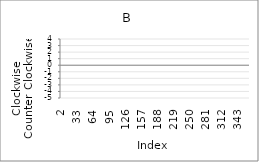
| Category | Series 0 |
|---|---|
| 2.0 | 4 |
| 3.0 | -4 |
| 4.0 | 1 |
| 5.0 | 3 |
| 6.0 | -3 |
| 7.0 | -3 |
| 8.0 | 2 |
| 9.0 | 2 |
| 10.0 | 3 |
| 11.0 | -4 |
| 12.0 | 4 |
| 13.0 | -1 |
| 14.0 | 1 |
| 15.0 | 0 |
| 16.0 | 0 |
| 17.0 | 0 |
| 18.0 | 2 |
| 19.0 | 3 |
| 20.0 | 2 |
| 21.0 | -3 |
| 22.0 | -5 |
| 23.0 | -4 |
| 24.0 | 1 |
| 25.0 | 4 |
| 26.0 | 0 |
| 27.0 | -4 |
| 28.0 | 4 |
| 29.0 | -2 |
| 30.0 | 0 |
| 31.0 | 99 |
| 32.0 | 99 |
| 33.0 | 99 |
| 34.0 | 99 |
| 35.0 | 99 |
| 36.0 | 99 |
| 37.0 | 99 |
| 38.0 | 99 |
| 39.0 | 99 |
| 40.0 | 99 |
| 41.0 | 99 |
| 42.0 | 99 |
| 43.0 | 99 |
| 44.0 | 99 |
| 45.0 | 99 |
| 46.0 | 99 |
| 47.0 | 99 |
| 48.0 | 99 |
| 49.0 | 99 |
| 50.0 | 99 |
| 51.0 | 99 |
| 52.0 | 99 |
| 53.0 | 99 |
| 54.0 | 99 |
| 55.0 | 99 |
| 56.0 | 99 |
| 57.0 | 99 |
| 58.0 | 99 |
| 59.0 | 99 |
| 60.0 | 99 |
| 61.0 | 99 |
| 62.0 | 99 |
| 63.0 | 99 |
| 64.0 | 99 |
| 65.0 | 99 |
| 66.0 | 99 |
| 67.0 | 99 |
| 68.0 | 99 |
| 69.0 | 99 |
| 70.0 | 99 |
| 71.0 | 99 |
| 72.0 | 99 |
| 73.0 | 99 |
| 74.0 | 99 |
| 75.0 | 99 |
| 76.0 | 99 |
| 77.0 | 99 |
| 78.0 | 99 |
| 79.0 | 99 |
| 80.0 | 99 |
| 81.0 | 99 |
| 82.0 | 99 |
| 83.0 | 99 |
| 84.0 | 99 |
| 85.0 | 99 |
| 86.0 | 99 |
| 87.0 | 99 |
| 88.0 | 99 |
| 89.0 | 99 |
| 90.0 | 99 |
| 91.0 | 99 |
| 92.0 | 99 |
| 93.0 | 99 |
| 94.0 | 99 |
| 95.0 | 99 |
| 96.0 | 99 |
| 97.0 | 99 |
| 98.0 | 99 |
| 99.0 | 99 |
| 100.0 | 99 |
| 101.0 | 99 |
| 102.0 | 99 |
| 103.0 | 99 |
| 104.0 | 99 |
| 105.0 | 99 |
| 106.0 | 99 |
| 107.0 | 99 |
| 108.0 | 99 |
| 109.0 | 99 |
| 110.0 | 99 |
| 111.0 | 99 |
| 112.0 | 99 |
| 113.0 | 99 |
| 114.0 | 99 |
| 115.0 | 99 |
| 116.0 | 99 |
| 117.0 | 99 |
| 118.0 | 99 |
| 119.0 | 99 |
| 120.0 | 99 |
| 121.0 | 99 |
| 122.0 | 99 |
| 123.0 | 99 |
| 124.0 | 99 |
| 125.0 | 99 |
| 126.0 | 99 |
| 127.0 | 99 |
| 128.0 | 99 |
| 129.0 | 99 |
| 130.0 | 99 |
| 131.0 | 99 |
| 132.0 | 99 |
| 133.0 | 99 |
| 134.0 | 99 |
| 135.0 | 99 |
| 136.0 | 99 |
| 137.0 | 99 |
| 138.0 | 99 |
| 139.0 | 99 |
| 140.0 | 99 |
| 141.0 | 99 |
| 142.0 | 99 |
| 143.0 | 99 |
| 144.0 | 99 |
| 145.0 | 99 |
| 146.0 | 99 |
| 147.0 | 99 |
| 148.0 | 99 |
| 149.0 | 99 |
| 150.0 | 99 |
| 151.0 | 99 |
| 152.0 | 99 |
| 153.0 | 99 |
| 154.0 | 99 |
| 155.0 | 99 |
| 156.0 | 99 |
| 157.0 | 99 |
| 158.0 | 99 |
| 159.0 | 99 |
| 160.0 | 99 |
| 161.0 | 99 |
| 162.0 | 99 |
| 163.0 | 99 |
| 164.0 | 99 |
| 165.0 | 99 |
| 166.0 | 99 |
| 167.0 | 99 |
| 168.0 | 99 |
| 169.0 | 99 |
| 170.0 | 99 |
| 171.0 | 99 |
| 172.0 | 99 |
| 173.0 | 99 |
| 174.0 | 99 |
| 175.0 | 99 |
| 176.0 | 99 |
| 177.0 | 99 |
| 178.0 | 99 |
| 179.0 | 99 |
| 180.0 | 99 |
| 181.0 | 99 |
| 182.0 | 99 |
| 183.0 | 99 |
| 184.0 | 99 |
| 185.0 | 99 |
| 186.0 | 99 |
| 187.0 | 99 |
| 188.0 | 99 |
| 189.0 | 99 |
| 190.0 | 99 |
| 191.0 | 99 |
| 192.0 | 99 |
| 193.0 | 99 |
| 194.0 | 99 |
| 195.0 | 99 |
| 196.0 | 99 |
| 197.0 | 99 |
| 198.0 | 99 |
| 199.0 | 99 |
| 200.0 | 99 |
| 201.0 | 99 |
| 202.0 | 99 |
| 203.0 | 99 |
| 204.0 | 99 |
| 205.0 | 99 |
| 206.0 | 99 |
| 207.0 | 99 |
| 208.0 | 99 |
| 209.0 | 99 |
| 210.0 | 99 |
| 211.0 | 99 |
| 212.0 | 99 |
| 213.0 | 99 |
| 214.0 | 99 |
| 215.0 | 99 |
| 216.0 | 99 |
| 217.0 | 99 |
| 218.0 | 99 |
| 219.0 | 99 |
| 220.0 | 99 |
| 221.0 | 99 |
| 222.0 | 99 |
| 223.0 | 99 |
| 224.0 | 99 |
| 225.0 | 99 |
| 226.0 | 99 |
| 227.0 | 99 |
| 228.0 | 99 |
| 229.0 | 99 |
| 230.0 | 99 |
| 231.0 | 99 |
| 232.0 | 99 |
| 233.0 | 99 |
| 234.0 | 99 |
| 235.0 | 99 |
| 236.0 | 99 |
| 237.0 | 99 |
| 238.0 | 99 |
| 239.0 | 99 |
| 240.0 | 99 |
| 241.0 | 99 |
| 242.0 | 99 |
| 243.0 | 99 |
| 244.0 | 99 |
| 245.0 | 99 |
| 246.0 | 99 |
| 247.0 | 99 |
| 248.0 | 99 |
| 249.0 | 99 |
| 250.0 | 99 |
| 251.0 | 99 |
| 252.0 | 99 |
| 253.0 | 99 |
| 254.0 | 99 |
| 255.0 | 99 |
| 256.0 | 99 |
| 257.0 | 99 |
| 258.0 | 99 |
| 259.0 | 99 |
| 260.0 | 99 |
| 261.0 | 99 |
| 262.0 | 99 |
| 263.0 | 99 |
| 264.0 | 99 |
| 265.0 | 99 |
| 266.0 | 99 |
| 267.0 | 99 |
| 268.0 | 99 |
| 269.0 | 99 |
| 270.0 | 99 |
| 271.0 | 99 |
| 272.0 | 99 |
| 273.0 | 99 |
| 274.0 | 99 |
| 275.0 | 99 |
| 276.0 | 99 |
| 277.0 | 99 |
| 278.0 | 99 |
| 279.0 | 99 |
| 280.0 | 99 |
| 281.0 | 99 |
| 282.0 | 99 |
| 283.0 | 99 |
| 284.0 | 99 |
| 285.0 | 99 |
| 286.0 | 99 |
| 287.0 | 99 |
| 288.0 | 99 |
| 289.0 | 99 |
| 290.0 | 99 |
| 291.0 | 99 |
| 292.0 | 99 |
| 293.0 | 99 |
| 294.0 | 99 |
| 295.0 | 99 |
| 296.0 | 99 |
| 297.0 | 99 |
| 298.0 | 99 |
| 299.0 | 99 |
| 300.0 | 99 |
| 301.0 | 99 |
| 302.0 | 99 |
| 303.0 | 99 |
| 304.0 | 99 |
| 305.0 | 99 |
| 306.0 | 99 |
| 307.0 | 99 |
| 308.0 | 99 |
| 309.0 | 99 |
| 310.0 | 99 |
| 311.0 | 99 |
| 312.0 | 99 |
| 313.0 | 99 |
| 314.0 | 99 |
| 315.0 | 99 |
| 316.0 | 99 |
| 317.0 | 99 |
| 318.0 | 99 |
| 319.0 | 99 |
| 320.0 | 99 |
| 321.0 | 99 |
| 322.0 | 99 |
| 323.0 | 99 |
| 324.0 | 99 |
| 325.0 | 99 |
| 326.0 | 99 |
| 327.0 | 99 |
| 328.0 | 99 |
| 329.0 | 99 |
| 330.0 | 99 |
| 331.0 | 99 |
| 332.0 | 99 |
| 333.0 | 99 |
| 334.0 | 99 |
| 335.0 | 99 |
| 336.0 | 99 |
| 337.0 | 99 |
| 338.0 | 99 |
| 339.0 | 99 |
| 340.0 | 99 |
| 341.0 | 99 |
| 342.0 | 99 |
| 343.0 | 99 |
| 344.0 | 99 |
| 345.0 | 99 |
| 346.0 | 99 |
| 347.0 | 99 |
| 348.0 | 99 |
| 349.0 | 99 |
| 350.0 | 99 |
| 351.0 | 99 |
| 352.0 | 99 |
| 353.0 | 99 |
| 354.0 | 99 |
| 355.0 | 99 |
| 356.0 | 99 |
| 357.0 | 99 |
| 358.0 | 99 |
| 359.0 | 99 |
| 360.0 | 99 |
| 361.0 | 99 |
| 362.0 | 99 |
| 363.0 | 99 |
| 364.0 | 99 |
| 365.0 | 99 |